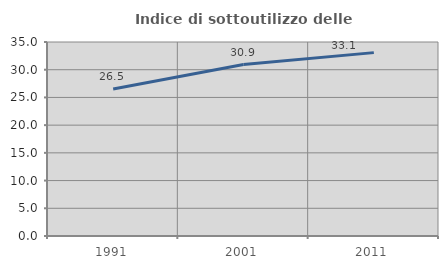
| Category | Indice di sottoutilizzo delle abitazioni  |
|---|---|
| 1991.0 | 26.514 |
| 2001.0 | 30.93 |
| 2011.0 | 33.083 |